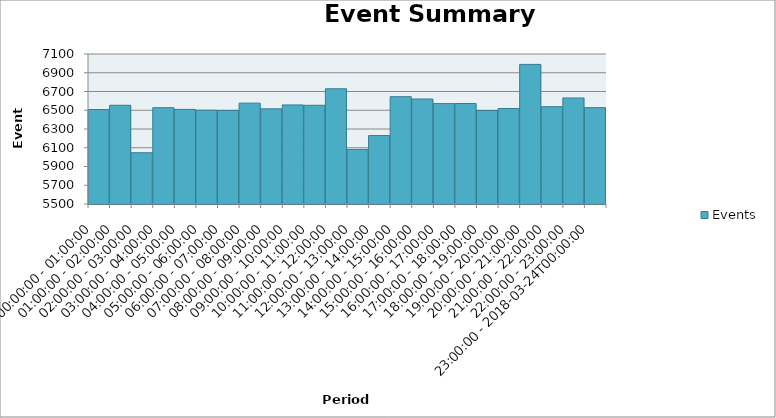
| Category | Events |
|---|---|
| 00:00:00 - 01:00:00 | 6508 |
| 01:00:00 - 02:00:00 | 6553 |
| 02:00:00 - 03:00:00 | 6047 |
| 03:00:00 - 04:00:00 | 6527 |
| 04:00:00 - 05:00:00 | 6509 |
| 05:00:00 - 06:00:00 | 6500 |
| 06:00:00 - 07:00:00 | 6498 |
| 07:00:00 - 08:00:00 | 6576 |
| 08:00:00 - 09:00:00 | 6515 |
| 09:00:00 - 10:00:00 | 6557 |
| 10:00:00 - 11:00:00 | 6553 |
| 11:00:00 - 12:00:00 | 6729 |
| 12:00:00 - 13:00:00 | 6082 |
| 13:00:00 - 14:00:00 | 6230 |
| 14:00:00 - 15:00:00 | 6645 |
| 15:00:00 - 16:00:00 | 6620 |
| 16:00:00 - 17:00:00 | 6571 |
| 17:00:00 - 18:00:00 | 6572 |
| 18:00:00 - 19:00:00 | 6497 |
| 19:00:00 - 20:00:00 | 6519 |
| 20:00:00 - 21:00:00 | 6989 |
| 21:00:00 - 22:00:00 | 6538 |
| 22:00:00 - 23:00:00 | 6631 |
| 23:00:00 - 2018-03-24T00:00:00 | 6528 |